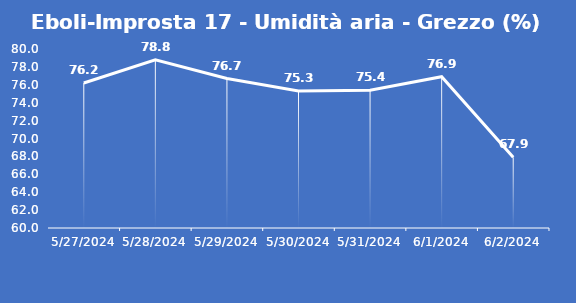
| Category | Eboli-Improsta 17 - Umidità aria - Grezzo (%) |
|---|---|
| 5/27/24 | 76.2 |
| 5/28/24 | 78.8 |
| 5/29/24 | 76.7 |
| 5/30/24 | 75.3 |
| 5/31/24 | 75.4 |
| 6/1/24 | 76.9 |
| 6/2/24 | 67.9 |